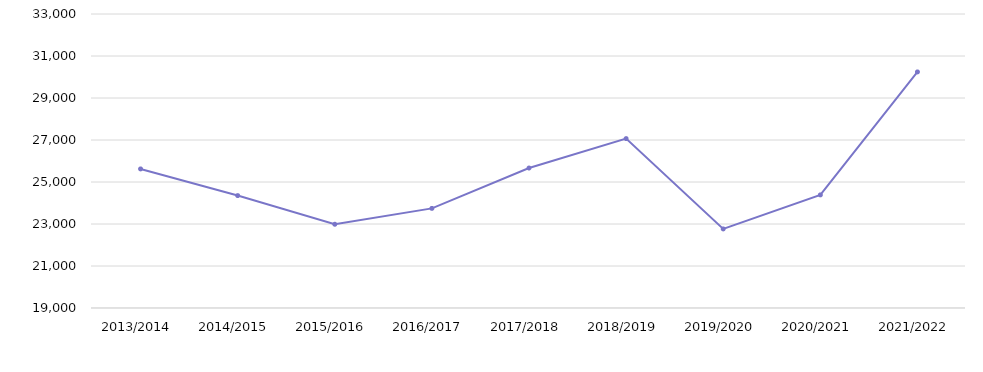
| Category | Series 0 |
|---|---|
| 2013/2014 | 25622 |
| 2014/2015 | 24353 |
| 2015/2016 | 22988 |
| 2016/2017 | 23744 |
| 2017/2018 | 25666 |
| 2018/2019 | 27067 |
| 2019/2020 | 22766 |
| 2020/2021 | 24385 |
| 2021/2022 | 30242 |